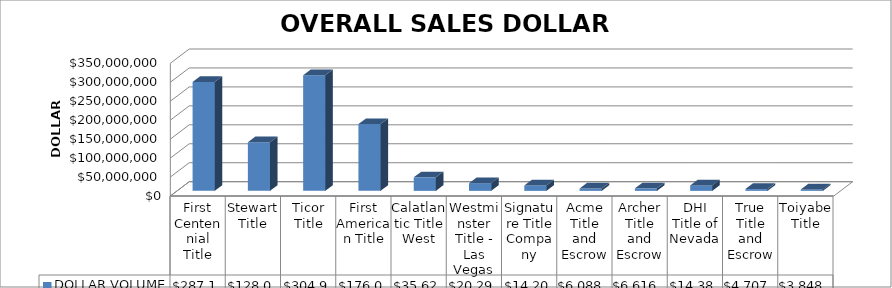
| Category | DOLLAR VOLUME |
|---|---|
| First Centennial Title | 287133416 |
| Stewart Title | 128063740.32 |
| Ticor Title | 304989395.78 |
| First American Title | 176091338.61 |
| Calatlantic Title West | 35626284 |
| Westminster Title - Las Vegas | 20290403 |
| Signature Title Company | 14209900 |
| Acme Title and Escrow | 6088500 |
| Archer Title and Escrow | 6616838 |
| DHI Title of Nevada | 14381350 |
| True Title and Escrow | 4707000 |
| Toiyabe Title | 3848500 |